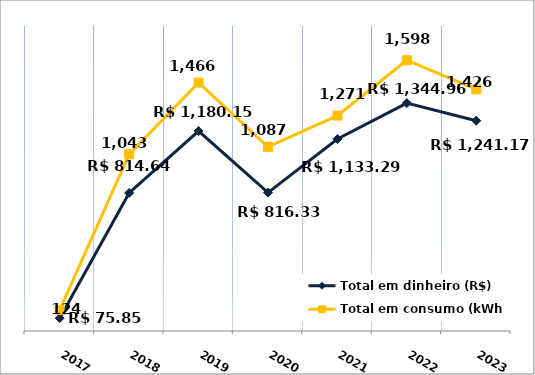
| Category | Total em dinheiro (R$) |
|---|---|
| 2017.0 | 75.85 |
| 2018.0 | 814.64 |
| 2019.0 | 1180.15 |
| 2020.0 | 816.33 |
| 2021.0 | 1133.29 |
| 2022.0 | 1344.96 |
| 2023.0 | 1241.17 |